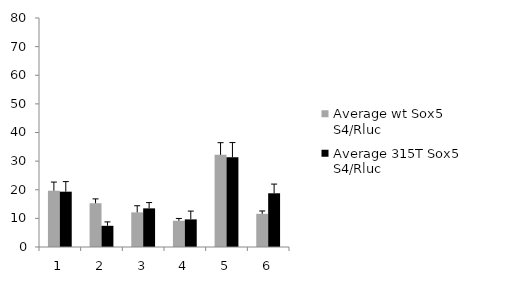
| Category | Average wt Sox5 S4/Rluc | Average 315T Sox5 S4/Rluc |
|---|---|---|
| 0 | 19.661 | 19.328 |
| 1 | 15.291 | 7.404 |
| 2 | 12.097 | 13.495 |
| 3 | 9.169 | 9.65 |
| 4 | 32.189 | 31.358 |
| 5 | 11.594 | 18.765 |